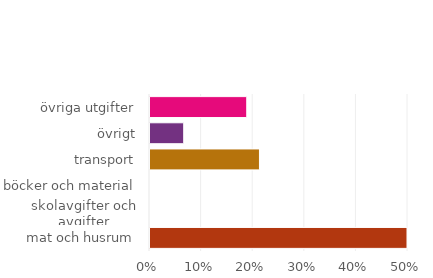
| Category | Series 0 |
|---|---|
| mat och husrum | 0.535 |
| skolavgifter och avgifter | 0 |
| böcker och material | 0 |
| transport | 0.212 |
| övrigt | 0.065 |
| övriga utgifter | 0.188 |